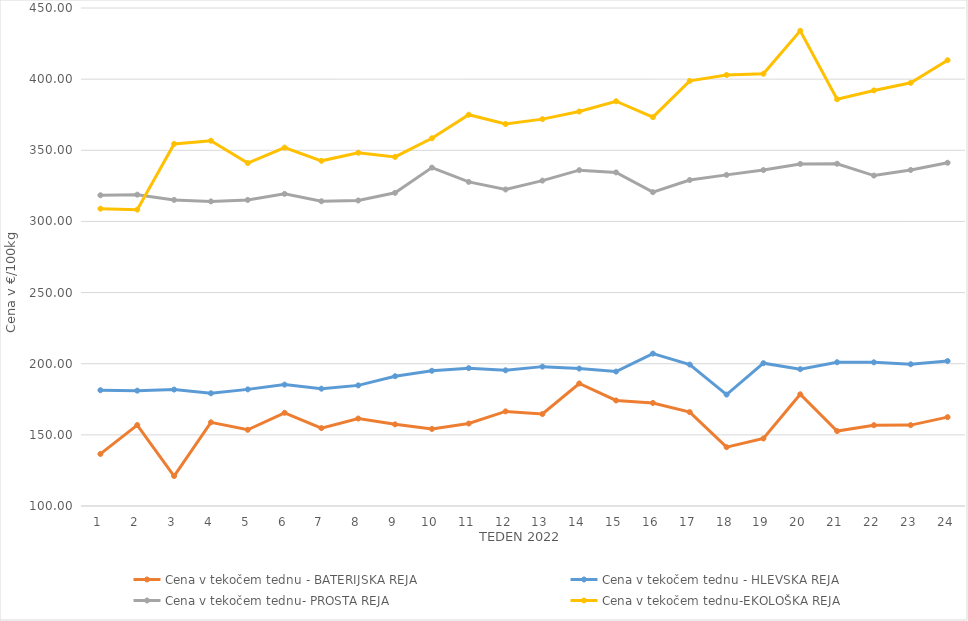
| Category | Cena v tekočem tednu - BATERIJSKA REJA | Cena v tekočem tednu - HLEVSKA REJA | Cena v tekočem tednu- PROSTA REJA | Cena v tekočem tednu-EKOLOŠKA REJA |
|---|---|---|---|---|
| 1.0 | 136.59 | 181.38 | 318.4 | 308.97 |
| 2.0 | 156.88 | 181.07 | 318.82 | 308.28 |
| 3.0 | 121.07 | 181.83 | 315.14 | 354.48 |
| 4.0 | 158.82 | 179.22 | 314.08 | 356.72 |
| 5.0 | 153.55 | 181.96 | 315.1 | 341.03 |
| 6.0 | 165.51 | 185.31 | 319.38 | 351.9 |
| 7.0 | 154.74 | 182.45 | 314.16 | 342.59 |
| 8.0 | 161.48 | 184.77 | 314.71 | 348.28 |
| 9.0 | 157.38 | 191.21 | 320.1 | 345.35 |
| 10.0 | 154.16 | 195.04 | 337.83 | 358.45 |
| 11.0 | 157.96 | 196.88 | 327.79 | 375 |
| 12.0 | 166.49 | 195.36 | 322.46 | 368.45 |
| 13.0 | 164.66 | 197.95 | 328.67 | 371.9 |
| 14.0 | 186.11 | 196.59 | 336.02 | 377.24 |
| 15.0 | 174.18 | 194.49 | 334.46 | 384.48 |
| 16.0 | 172.42 | 207.1 | 320.58 | 373.28 |
| 17.0 | 165.96 | 199.41 | 329.11 | 398.79 |
| 18.0 | 141.36 | 178.29 | 332.71 | 402.93 |
| 19.0 | 147.43 | 200.37 | 336.11 | 403.79 |
| 20.0 | 178.51 | 196.16 | 340.4 | 433.97 |
| 21.0 | 152.67 | 201.05 | 340.55 | 385.86 |
| 22.0 | 156.8 | 200.98 | 332.23 | 392.07 |
| 23.0 | 156.84 | 199.63 | 336.16 | 397.41 |
| 24.0 | 162.44 | 201.86 | 341.24 | 413.28 |